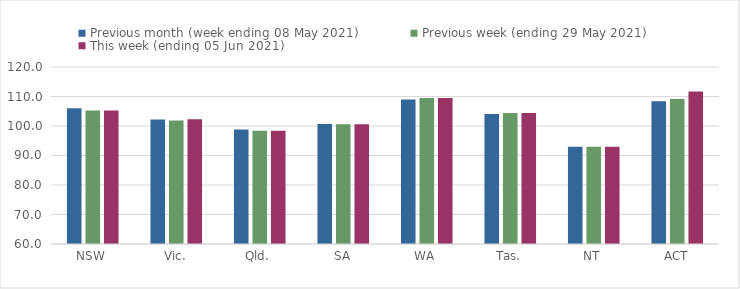
| Category | Previous month (week ending 08 May 2021) | Previous week (ending 29 May 2021) | This week (ending 05 Jun 2021) |
|---|---|---|---|
| NSW | 106.03 | 105.29 | 105.29 |
| Vic. | 102.2 | 101.86 | 102.26 |
| Qld. | 98.85 | 98.37 | 98.37 |
| SA | 100.68 | 100.62 | 100.62 |
| WA | 108.99 | 109.46 | 109.46 |
| Tas. | 104.1 | 104.41 | 104.41 |
| NT | 92.96 | 92.96 | 92.96 |
| ACT | 108.42 | 109.14 | 111.7 |